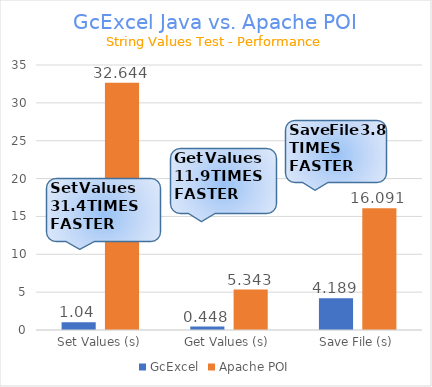
| Category | GcExcel | Apache POI |
|---|---|---|
| Set Values (s) | 1.04 | 32.644 |
| Get Values (s) | 0.448 | 5.343 |
| Save File (s) | 4.189 | 16.091 |